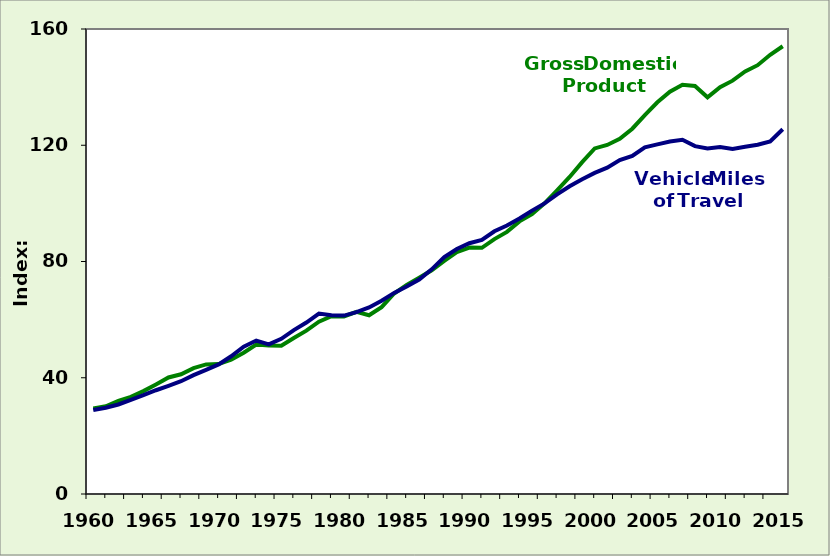
| Category | GDP Indexed to 1996 | VMT Indexed to 1996 |
|---|---|---|
| 1960.0 | 29.4 | 28.9 |
| 1961.0 | 30.2 | 29.7 |
| 1962.0 | 32 | 30.8 |
| 1963.0 | 33.4 | 32.4 |
| 1964.0 | 35.4 | 34 |
| 1965.0 | 37.7 | 35.7 |
| 1966.0 | 40.1 | 37.2 |
| 1967.0 | 41.2 | 38.8 |
| 1968.0 | 43.3 | 40.9 |
| 1969.0 | 44.6 | 42.7 |
| 1970.0 | 44.7 | 44.6 |
| 1971.0 | 46.2 | 47.4 |
| 1972.0 | 48.6 | 50.7 |
| 1973.0 | 51.4 | 52.8 |
| 1974.0 | 51.1 | 51.5 |
| 1975.0 | 51 | 53.4 |
| 1976.0 | 53.7 | 56.4 |
| 1977.0 | 56.2 | 59 |
| 1978.0 | 59.3 | 62.1 |
| 1979.0 | 61.2 | 61.5 |
| 1980.0 | 61.1 | 61.4 |
| 1981.0 | 62.7 | 62.6 |
| 1982.0 | 61.5 | 64.2 |
| 1983.0 | 64.3 | 66.5 |
| 1984.0 | 69 | 69.2 |
| 1985.0 | 71.9 | 71.4 |
| 1986.0 | 74.4 | 73.8 |
| 1987.0 | 77 | 77.3 |
| 1988.0 | 80.2 | 81.5 |
| 1989.0 | 83.2 | 84.3 |
| 1990.0 | 84.8 | 86.3 |
| 1991.0 | 84.7 | 87.4 |
| 1992.0 | 87.7 | 90.4 |
| 1993.0 | 90.2 | 92.4 |
| 1994.0 | 93.8 | 94.8 |
| 1995.0 | 96.3 | 97.5 |
| 1996.0 | 100 | 100 |
| 1997.0 | 104.5 | 103.1 |
| 1998.0 | 109.1 | 105.9 |
| 1999.0 | 114.2 | 108.3 |
| 2000.0 | 118.9 | 110.5 |
| 2001.0 | 120.1 | 112.3 |
| 2002.0 | 122.2 | 114.9 |
| 2003.0 | 125.7 | 116.3 |
| 2004.0 | 130.4 | 119.3 |
| 2005.0 | 134.8 | 120.3 |
| 2006.0 | 138.4 | 121.3 |
| 2007.0 | 140.8 | 121.9 |
| 2008.0 | 140.4 | 119.7 |
| 2009.0 | 136.5 | 118.9 |
| 2010.0 | 140 | 119.4 |
| 2011.0 | 142.227 | 118.7 |
| 2012.0 | 145.39 | 119.5 |
| 2013.0 | 147.555 | 120.2 |
| 2014.0 | 151.138 | 121.3 |
| 2015.0 | 154.058 | 125.5 |